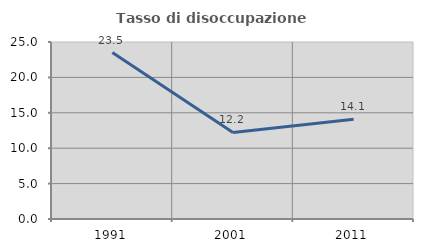
| Category | Tasso di disoccupazione giovanile  |
|---|---|
| 1991.0 | 23.506 |
| 2001.0 | 12.23 |
| 2011.0 | 14.103 |